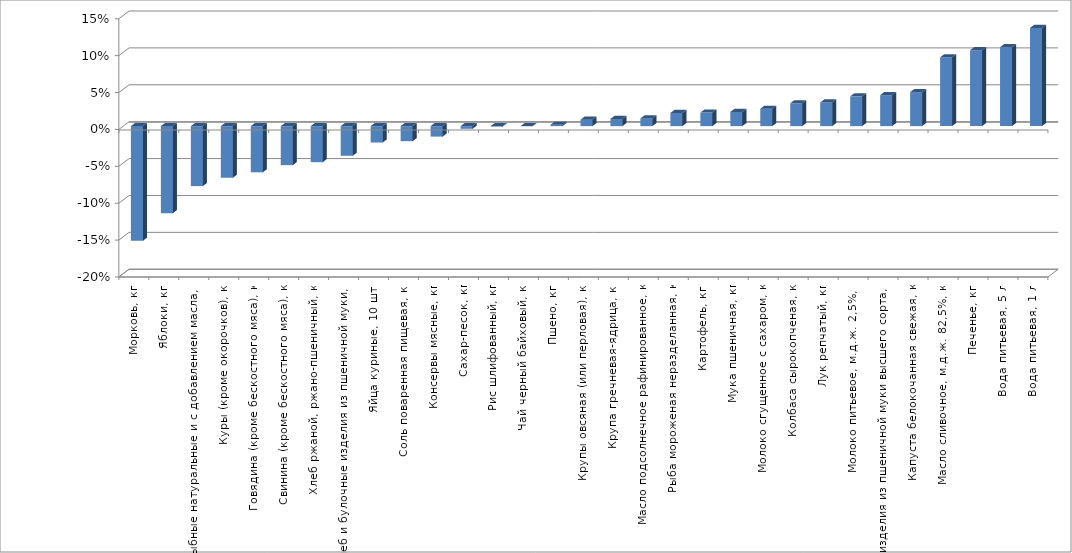
| Category | Series 0 |
|---|---|
| Морковь, кг | -0.155 |
| Яблоки, кг | -0.118 |
| Консервы рыбные натуральные и с добавлением масла, кг | -0.081 |
| Куры (кроме окорочков), кг | -0.07 |
| Говядина (кроме бескостного мяса), кг | -0.063 |
| Свинина (кроме бескостного мяса), кг | -0.053 |
| Хлеб ржаной, ржано-пшеничный, кг | -0.049 |
| Хлеб и булочные изделия из пшеничной муки, кг | -0.04 |
| Яйца куриные, 10 шт. | -0.022 |
| Соль поваренная пищевая, кг | -0.02 |
| Консервы мясные, кг | -0.014 |
| Сахар-песок, кг | -0.004 |
| Рис шлифованный, кг | -0.001 |
| Чай черный байховый, кг | 0 |
| Пшено, кг | 0.002 |
| Крупы овсяная (или перловая), кг | 0.009 |
| Крупа гречневая-ядрица, кг | 0.01 |
| Масло подсолнечное рафинированное, кг | 0.01 |
| Рыба мороженая неразделанная, кг | 0.018 |
| Картофель, кг | 0.018 |
| Мука пшеничная, кг | 0.019 |
| Молоко сгущенное с сахаром, кг | 0.024 |
| Колбаса сырокопченая, кг | 0.031 |
| Лук репчатый, кг | 0.032 |
| Молоко питьевое, м.д.ж. 2,5%, л | 0.04 |
| Макаронные изделия из пшеничной муки высшего сорта, кг | 0.042 |
| Капуста белокочанная свежая, кг | 0.046 |
| Масло сливочное, м.д.ж. 82,5%, кг | 0.093 |
| Печенье, кг | 0.103 |
| Вода питьевая, 5 л | 0.107 |
| Вода питьевая, 1 л | 0.133 |